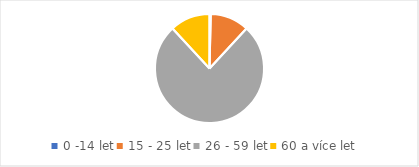
| Category | Series 0 |
|---|---|
| 0 -14 let | 1 |
| 15 - 25 let | 30 |
| 26 - 59 let | 199 |
| 60 a více let | 31 |